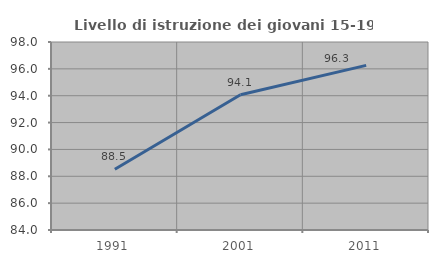
| Category | Livello di istruzione dei giovani 15-19 anni |
|---|---|
| 1991.0 | 88.526 |
| 2001.0 | 94.07 |
| 2011.0 | 96.258 |